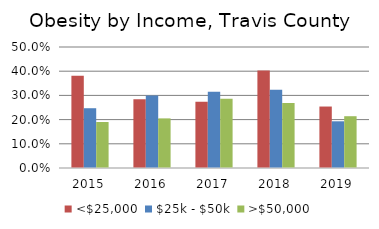
| Category | <$25,000 | $25k - $50k | >$50,000 |
|---|---|---|---|
| 2015.0 | 0.381 | 0.247 | 0.19 |
| 2016.0 | 0.284 | 0.3 | 0.205 |
| 2017.0 | 0.274 | 0.315 | 0.286 |
| 2018.0 | 0.403 | 0.323 | 0.269 |
| 2019.0 | 0.254 | 0.193 | 0.214 |